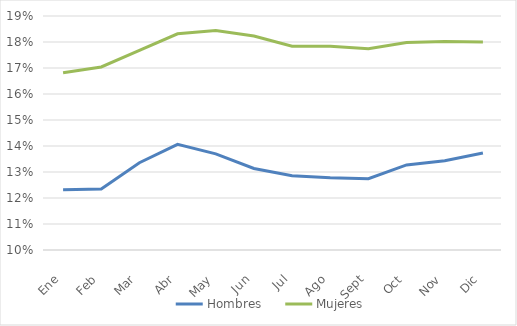
| Category | Hombres  | Mujeres |
|---|---|---|
| Ene | 0.123 | 0.168 |
| Feb | 0.123 | 0.17 |
| Mar | 0.134 | 0.177 |
| Abr | 0.141 | 0.183 |
| May | 0.137 | 0.184 |
| Jun | 0.131 | 0.182 |
| Jul | 0.129 | 0.178 |
| Ago | 0.128 | 0.178 |
| Sept | 0.127 | 0.177 |
| Oct | 0.133 | 0.18 |
| Nov | 0.134 | 0.18 |
| Dic | 0.137 | 0.18 |